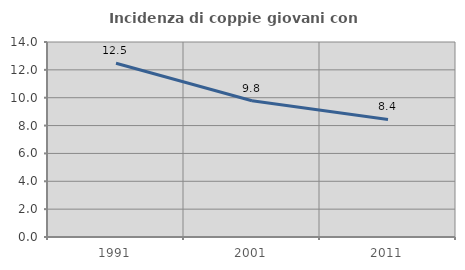
| Category | Incidenza di coppie giovani con figli |
|---|---|
| 1991.0 | 12.476 |
| 2001.0 | 9.786 |
| 2011.0 | 8.443 |